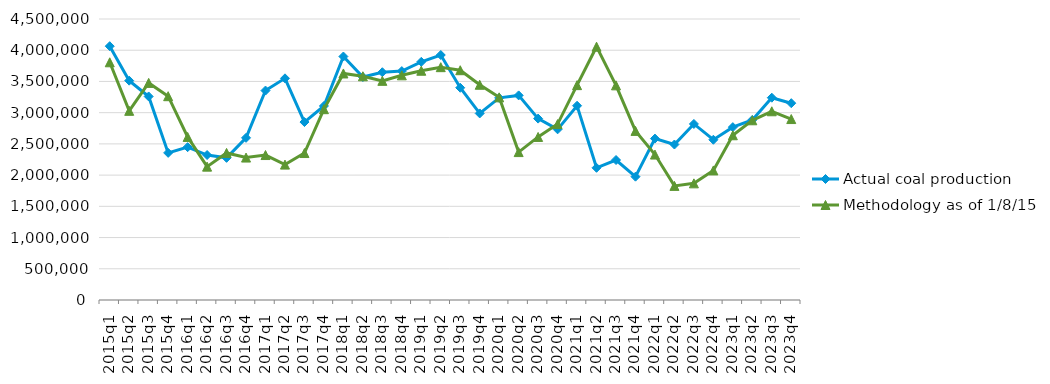
| Category | Actual coal production | Methodology as of 1/8/15 |
|---|---|---|
| 2015q1 | 4064554 | 3806792 |
| 2015q2 | 3512402 | 3029232 |
| 2015q3 | 3259412 | 3476784 |
| 2015q4 | 2356174 | 3263843 |
| 2016q1 | 2447918 | 2611374 |
| 2016q2 | 2321692 | 2135887 |
| 2016q3 | 2276399 | 2355236 |
| 2016q4 | 2596965 | 2281014 |
| 2017q1 | 3354142 | 2321498 |
| 2017q2 | 3549816 | 2168008 |
| 2017q3 | 2849663 | 2353524 |
| 2017q4 | 3107037 | 3055889 |
| 2018q1 | 3899211 | 3627813 |
| 2018q2 | 3570744 | 3582921 |
| 2018q3 | 3647599 | 3509445 |
| 2018q4 | 3665563 | 3598170 |
| 2019q1 | 3814165 | 3671304 |
| 2019q2 | 3923369 | 3728684 |
| 2019q3 | 3399062 | 3680019 |
| 2019q4 | 2987593 | 3446705 |
| 2020q1 | 3236691 | 3245515 |
| 2020q2 | 3276597 | 2368802 |
| 2020q3 | 2905033 | 2611286 |
| 2020q4 | 2733075 | 2817412 |
| 2021q1 | 3110840 | 3440973 |
| 2021q2 | 2117045 | 4056421 |
| 2021q3 | 2241795 | 3437528 |
| 2021q4 | 1974758 | 2707918 |
| 2022q1 | 2584862 | 2328929 |
| 2022q2 | 2489923 | 1827491 |
| 2022q3 | 2819418 | 1868044 |
| 2022q4 | 2566243 | 2074881 |
| 2023q1 | 2768200 | 2638282 |
| 2023q2 | 2883678 | 2877825 |
| 2023q3 | 3239690 | 3022426 |
| 2023q4 | 3151743 | 2897822 |